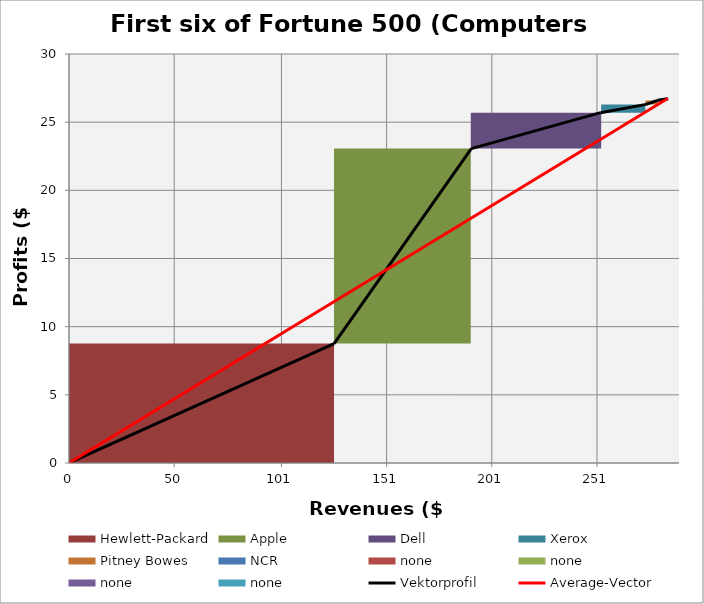
| Category | transparent | Hewlett-Packard | Apple | Dell | Xerox | Pitney Bowes | NCR | none | Border right & top |
|---|---|---|---|---|---|---|---|---|---|
| 0.0 | 0 | 8.761 | 0 | 0 | 0 | 0 | 0 | 0 | 0 |
| 126.033 | 0 | 8.761 | 0 | 0 | 0 | 0 | 0 | 0 | 0 |
| 126.033 | 8.761 | 0 | 14.301 | 0 | 0 | 0 | 0 | 0 | 0 |
| 191.25799999999998 | 8.761 | 0 | 14.301 | 0 | 0 | 0 | 0 | 0 | 0 |
| 191.25799999999998 | 23.062 | 0 | 0 | 2.635 | 0 | 0 | 0 | 0 | 0 |
| 252.75199999999998 | 23.062 | 0 | 0 | 2.635 | 0 | 0 | 0 | 0 | 0 |
| 252.75199999999998 | 25.697 | 0 | 0 | 0 | 0.606 | 0 | 0 | 0 | 0 |
| 274.385 | 25.697 | 0 | 0 | 0 | 0.606 | 0 | 0 | 0 | 0 |
| 274.385 | 26.303 | 0 | 0 | 0 | 0 | 0.292 | 0 | 0 | 0 |
| 279.8103 | 26.303 | 0 | 0 | 0 | 0 | 0.292 | 0 | 0 | 0 |
| 279.8103 | 26.596 | 0 | 0 | 0 | 0 | 0 | 0.134 | 0 | 0 |
| 284.6293 | 26.596 | 0 | 0 | 0 | 0 | 0 | 0.134 | 0 | 0 |
| 284.6293 | 26.73 | 0 | 0 | 0 | 0 | 0 | 0 | 0 | 0 |
| 284.6293 | 26.73 | 0 | 0 | 0 | 0 | 0 | 0 | 0 | 0 |
| 284.6293 | 26.73 | 0 | 0 | 0 | 0 | 0 | 0 | 0 | 0 |
| 284.6293 | 26.73 | 0 | 0 | 0 | 0 | 0 | 0 | 0 | 0 |
| 284.6293 | 26.73 | 0 | 0 | 0 | 0 | 0 | 0 | 0 | 0 |
| 284.6293 | 26.73 | 0 | 0 | 0 | 0 | 0 | 0 | 0 | 0 |
| 284.6293 | 26.73 | 0 | 0 | 0 | 0 | 0 | 0 | 0 | 0 |
| 284.6293 | 26.73 | 0 | 0 | 0 | 0 | 0 | 0 | 0 | 0 |
| 284.6293 | 26.73 | 0 | 0 | 0 | 0 | 0 | 0 | 0 | 0 |
| 289.6293 | 26.73 | 0 | 0 | 0 | 0 | 0 | 0 | 0 | 0 |
| 289.6293 | 26.73 | 0 | 0 | 0 | 0 | 0 | 0 | 0 | 0 |